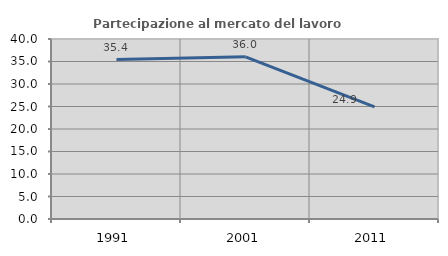
| Category | Partecipazione al mercato del lavoro  femminile |
|---|---|
| 1991.0 | 35.422 |
| 2001.0 | 36.034 |
| 2011.0 | 24.928 |